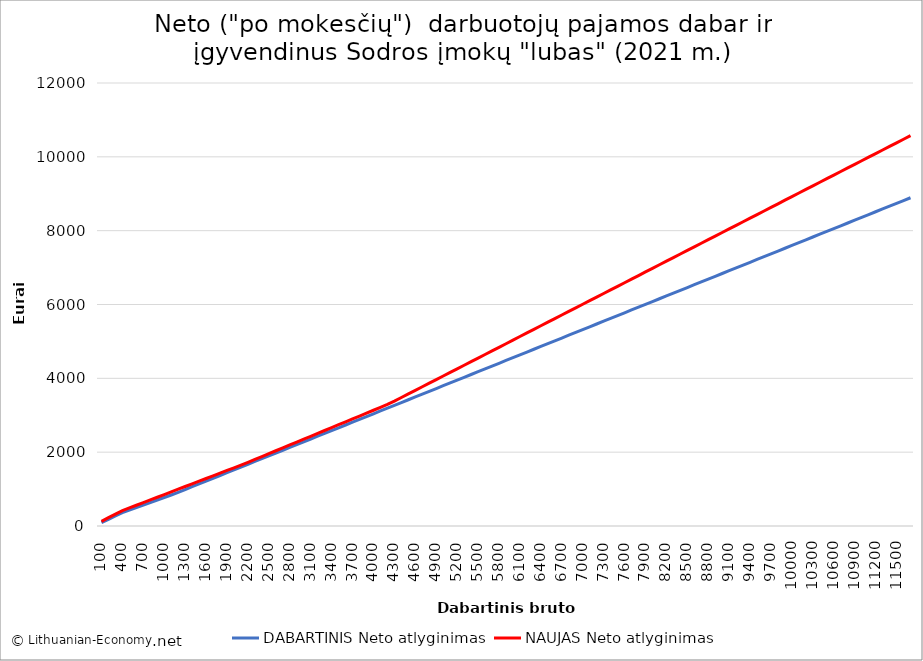
| Category | DABARTINIS Neto atlyginimas | NAUJAS Neto atlyginimas |
|---|---|---|
| 100.0 | 91 | 126.083 |
| 200.0 | 182 | 224.859 |
| 300.0 | 273 | 323.634 |
| 400.0 | 361 | 416.967 |
| 500.0 | 429.5 | 489.456 |
| 600.0 | 498 | 561.945 |
| 700.0 | 566.5 | 634.434 |
| 800.0 | 635 | 706.923 |
| 900.0 | 703.5 | 779.412 |
| 1000.0 | 772 | 851.901 |
| 1100.0 | 840.5 | 924.39 |
| 1200.0 | 912 | 996.879 |
| 1300.0 | 988 | 1069.367 |
| 1400.0 | 1064 | 1141.856 |
| 1500.0 | 1140 | 1214.345 |
| 1600.0 | 1216 | 1286.834 |
| 1700.0 | 1292 | 1359.323 |
| 1800.0 | 1368 | 1431.812 |
| 1900.0 | 1444 | 1504.301 |
| 2000.0 | 1520 | 1576.79 |
| 2100.0 | 1596 | 1649.279 |
| 2200.0 | 1672 | 1724.621 |
| 2300.0 | 1748 | 1803.012 |
| 2400.0 | 1824 | 1881.404 |
| 2500.0 | 1900 | 1959.796 |
| 2600.0 | 1976 | 2038.188 |
| 2700.0 | 2052 | 2116.58 |
| 2800.0 | 2128 | 2194.972 |
| 2900.0 | 2204 | 2273.363 |
| 3000.0 | 2280 | 2351.755 |
| 3100.0 | 2356 | 2430.147 |
| 3200.0 | 2432 | 2508.539 |
| 3300.0 | 2508 | 2586.931 |
| 3400.0 | 2584 | 2665.323 |
| 3500.0 | 2660 | 2743.714 |
| 3600.0 | 2736 | 2822.106 |
| 3700.0 | 2812 | 2900.498 |
| 3800.0 | 2888 | 2978.89 |
| 3900.0 | 2964 | 3057.282 |
| 4000.0 | 3040 | 3135.674 |
| 4100.0 | 3116 | 3214.065 |
| 4200.0 | 3192 | 3292.457 |
| 4300.0 | 3268 | 3383.002 |
| 4400.0 | 3344 | 3480.182 |
| 4500.0 | 3420 | 3577.362 |
| 4600.0 | 3496 | 3674.542 |
| 4700.0 | 3572 | 3771.722 |
| 4800.0 | 3648 | 3868.902 |
| 4900.0 | 3724 | 3966.082 |
| 5000.0 | 3800 | 4063.262 |
| 5100.0 | 3876 | 4160.442 |
| 5200.0 | 3952 | 4257.622 |
| 5300.0 | 4028 | 4354.802 |
| 5400.0 | 4104 | 4451.982 |
| 5500.0 | 4180 | 4549.162 |
| 5600.0 | 4256 | 4646.342 |
| 5700.0 | 4332 | 4743.522 |
| 5800.0 | 4408 | 4840.702 |
| 5900.0 | 4484 | 4937.882 |
| 6000.0 | 4560 | 5035.062 |
| 6100.0 | 4636 | 5132.241 |
| 6200.0 | 4712 | 5229.421 |
| 6300.0 | 4788 | 5326.601 |
| 6400.0 | 4864 | 5423.781 |
| 6500.0 | 4940 | 5520.961 |
| 6600.0 | 5016 | 5618.141 |
| 6700.0 | 5092 | 5715.321 |
| 6800.0 | 5168 | 5812.501 |
| 6900.0 | 5244 | 5909.681 |
| 7000.0 | 5320 | 6006.861 |
| 7100.0 | 5396 | 6104.041 |
| 7200.0 | 5472 | 6201.221 |
| 7300.0 | 5548 | 6298.401 |
| 7400.0 | 5624 | 6395.581 |
| 7500.0 | 5700 | 6492.761 |
| 7600.0 | 5776 | 6589.941 |
| 7700.0 | 5852 | 6687.121 |
| 7800.0 | 5928 | 6784.301 |
| 7900.0 | 6004 | 6881.481 |
| 8000.0 | 6080 | 6978.661 |
| 8100.0 | 6156 | 7075.841 |
| 8200.0 | 6232 | 7173.021 |
| 8300.0 | 6308 | 7270.201 |
| 8400.0 | 6384 | 7367.381 |
| 8500.0 | 6460 | 7464.561 |
| 8600.0 | 6536 | 7561.741 |
| 8700.0 | 6612 | 7658.921 |
| 8800.0 | 6688 | 7756.101 |
| 8900.0 | 6764 | 7853.281 |
| 9000.0 | 6840 | 7950.461 |
| 9100.0 | 6916 | 8047.641 |
| 9200.0 | 6992 | 8144.821 |
| 9300.0 | 7068 | 8242 |
| 9400.0 | 7144 | 8339.18 |
| 9500.0 | 7220 | 8436.36 |
| 9600.0 | 7296 | 8533.54 |
| 9700.0 | 7372 | 8630.72 |
| 9800.0 | 7448 | 8727.9 |
| 9900.0 | 7524 | 8825.08 |
| 10000.0 | 7600 | 8922.26 |
| 10100.0 | 7676 | 9019.44 |
| 10200.0 | 7752 | 9116.62 |
| 10300.0 | 7828 | 9213.8 |
| 10400.0 | 7904 | 9310.98 |
| 10500.0 | 7980 | 9408.16 |
| 10600.0 | 8056 | 9505.34 |
| 10700.0 | 8132 | 9602.52 |
| 10800.0 | 8208 | 9699.7 |
| 10900.0 | 8284 | 9796.88 |
| 11000.0 | 8360 | 9894.06 |
| 11100.0 | 8436 | 9991.24 |
| 11200.0 | 8512 | 10088.42 |
| 11300.0 | 8588 | 10185.6 |
| 11400.0 | 8664 | 10282.78 |
| 11500.0 | 8740 | 10379.96 |
| 11600.0 | 8816 | 10477.14 |
| 11700.0 | 8892 | 10574.32 |